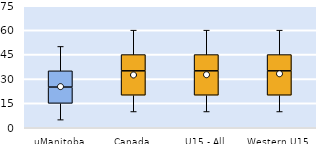
| Category | 25th | 50th | 75th |
|---|---|---|---|
| uManitoba | 15 | 10 | 10 |
| Canada | 20 | 15 | 10 |
| U15 - All | 20 | 15 | 10 |
| Western U15 | 20 | 15 | 10 |